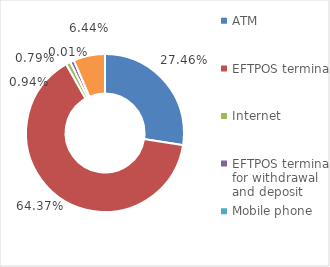
| Category | Number of transactions |
|---|---|
| ATM | 104078960 |
| EFTPOS terminal | 243976045 |
| Internet | 3565003 |
| EFTPOS terminal for withdrawal and deposit | 2987722 |
| Mobile phone | 24609 |
| Other | 24397626 |